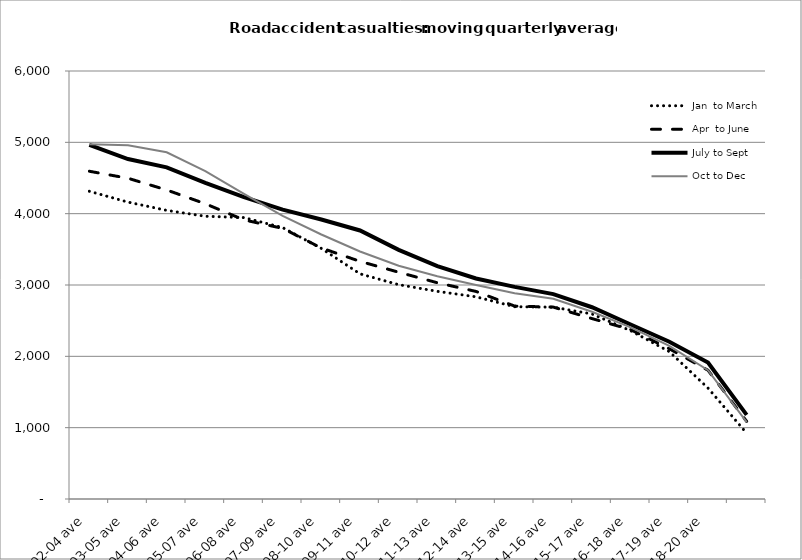
| Category | Jan  to March | Apr  to June | July to Sept | Oct to Dec |
|---|---|---|---|---|
| 2002-04 ave | 4314 | 4594.667 | 4963 | 4972.667 |
| 2003-05 ave | 4161.667 | 4496.333 | 4766 | 4958.667 |
| 2004-06 ave | 4046 | 4332.333 | 4648.667 | 4860 |
| 2005-07 ave | 3963.667 | 4138.667 | 4433 | 4597.333 |
| 2006-08 ave | 3945 | 3912.333 | 4231.667 | 4277.667 |
| 2007-09 ave | 3804.667 | 3793.667 | 4056.333 | 3970 |
| 2008-10 ave | 3512.667 | 3519 | 3917.667 | 3708.333 |
| 2009-11 ave | 3156.333 | 3331.333 | 3764.333 | 3470 |
| 2010-12 ave | 3004.333 | 3179.333 | 3492.333 | 3269 |
| 2011-13 ave | 2911.333 | 3031.333 | 3265 | 3122 |
| 2012-14 ave | 2834.333 | 2910 | 3091 | 3000 |
| 2013-15 ave | 2695.333 | 2704.333 | 2973.667 | 2883.667 |
| 2014-16 ave | 2689.333 | 2690 | 2872 | 2807.667 |
| 2015-17 ave | 2593.333 | 2529 | 2688.333 | 2625.333 |
| 2016-18 ave | 2359.333 | 2374 | 2446.333 | 2405.333 |
| 2017-19 ave | 2065.667 | 2105.667 | 2204 | 2145.333 |
| 2018-20 ave | 1555 | 1804.667 | 1912.333 | 1805.333 |